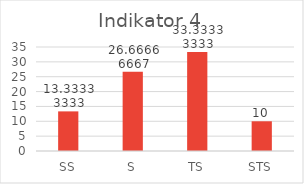
| Category | Series 0 |
|---|---|
| 0 | 13.333 |
| 1 | 26.667 |
| 2 | 33.333 |
| 3 | 10 |